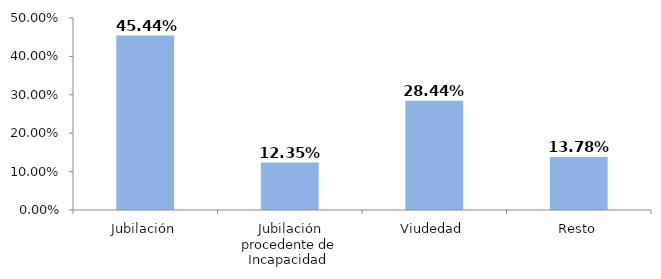
| Category | Series 0 |
|---|---|
| Jubilación | 0.454 |
| Jubilación procedente de Incapacidad  | 0.123 |
| Viudedad | 0.284 |
| Resto | 0.138 |